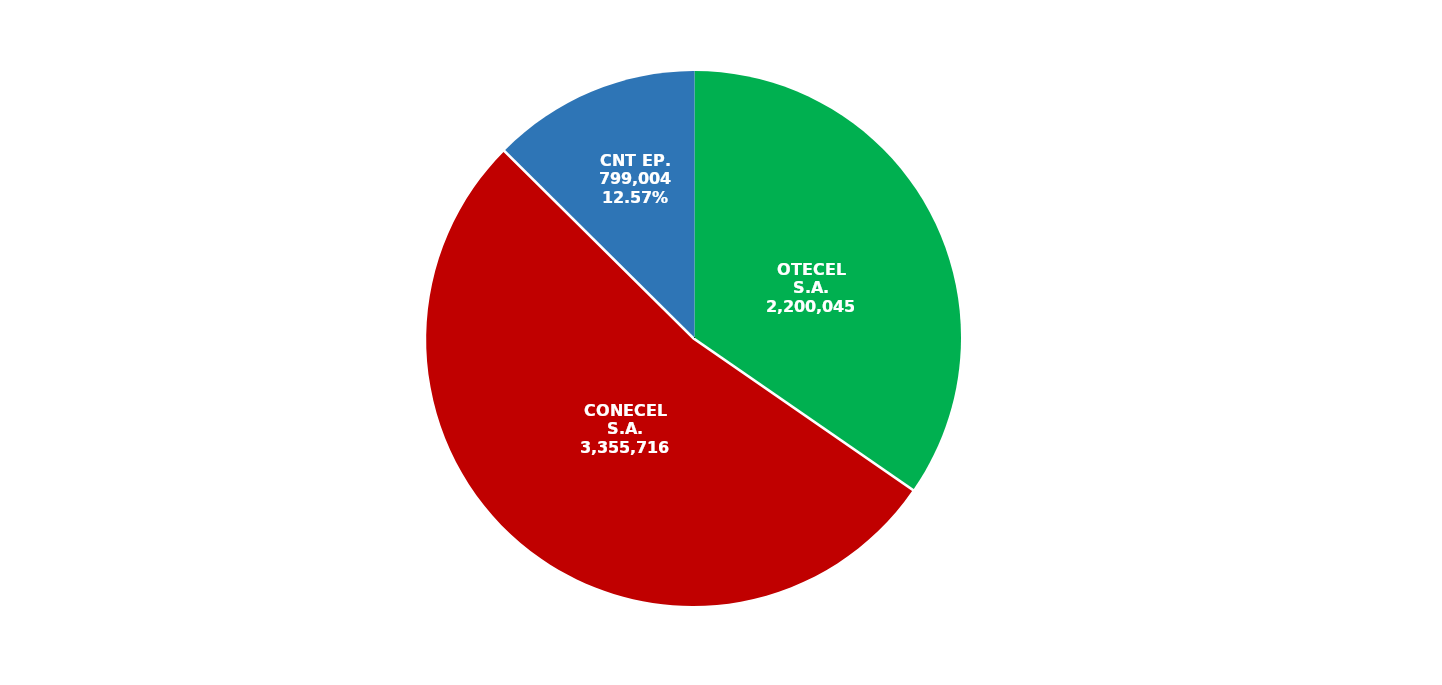
| Category | Series 0 |
|---|---|
| OTECEL S.A. | 2200045 |
| CONECEL S.A. | 3355716 |
| CNT EP. | 799004 |